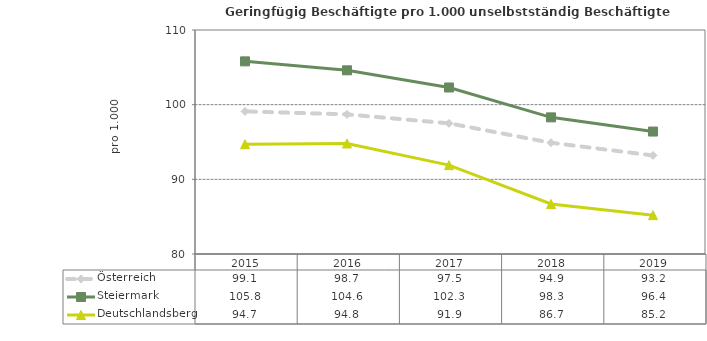
| Category | Österreich | Steiermark | Deutschlandsberg |
|---|---|---|---|
| 2019.0 | 93.2 | 96.4 | 85.2 |
| 2018.0 | 94.9 | 98.3 | 86.7 |
| 2017.0 | 97.5 | 102.3 | 91.9 |
| 2016.0 | 98.7 | 104.6 | 94.8 |
| 2015.0 | 99.1 | 105.8 | 94.7 |